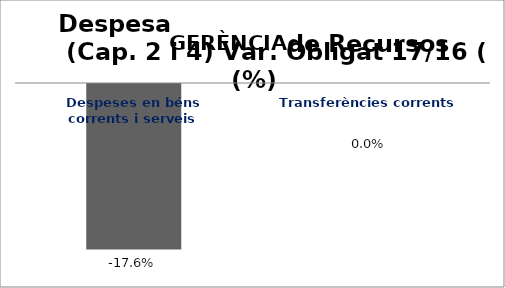
| Category | Series 0 |
|---|---|
| Despeses en béns corrents i serveis | -0.176 |
| Transferències corrents | 0 |